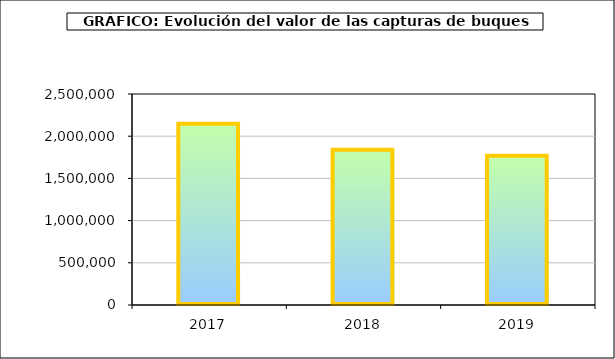
| Category | Series1 |
|---|---|
| 2017.0 | 2147014.107 |
| 2018.0 | 1839877.98 |
| 2019.0 | 1767392.171 |